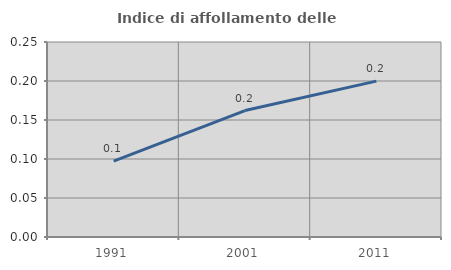
| Category | Indice di affollamento delle abitazioni  |
|---|---|
| 1991.0 | 0.097 |
| 2001.0 | 0.162 |
| 2011.0 | 0.2 |